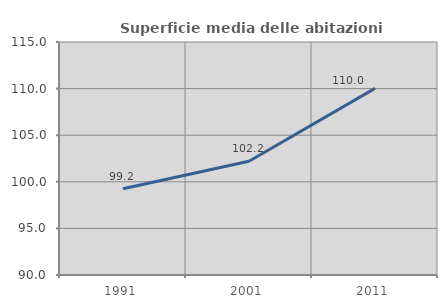
| Category | Superficie media delle abitazioni occupate |
|---|---|
| 1991.0 | 99.246 |
| 2001.0 | 102.203 |
| 2011.0 | 110.023 |